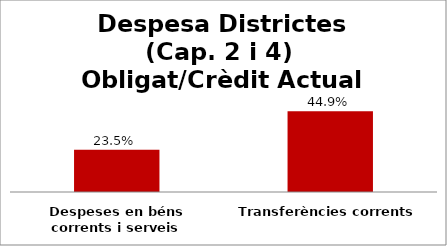
| Category | Series 0 |
|---|---|
| Despeses en béns corrents i serveis | 0.235 |
| Transferències corrents | 0.449 |